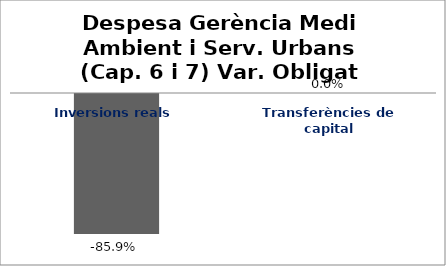
| Category | Series 0 |
|---|---|
| Inversions reals | -0.859 |
| Transferències de capital | 0 |